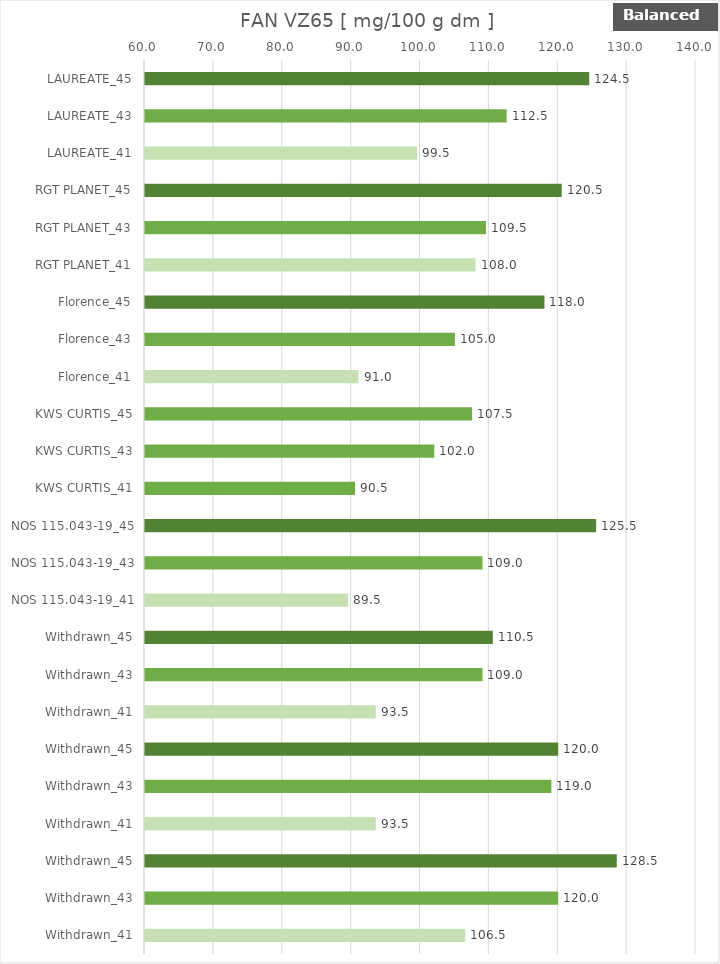
| Category |    FAN VZ65 [ mg/100 g dm ] |
|---|---|
| LAUREATE_45 | 124.5 |
| LAUREATE_43 | 112.5 |
| LAUREATE_41 | 99.5 |
| RGT PLANET_45 | 120.5 |
| RGT PLANET_43 | 109.5 |
| RGT PLANET_41 | 108 |
| Florence_45 | 118 |
| Florence_43 | 105 |
| Florence_41 | 91 |
| KWS CURTIS_45 | 107.5 |
| KWS CURTIS_43 | 102 |
| KWS CURTIS_41 | 90.5 |
| NOS 115.043-19_45 | 125.5 |
| NOS 115.043-19_43 | 109 |
| NOS 115.043-19_41 | 89.5 |
| Withdrawn_45 | 110.5 |
| Withdrawn_43 | 109 |
| Withdrawn_41 | 93.5 |
| Withdrawn_45 | 120 |
| Withdrawn_43 | 119 |
| Withdrawn_41 | 93.5 |
| Withdrawn_45 | 128.5 |
| Withdrawn_43 | 120 |
| Withdrawn_41 | 106.5 |